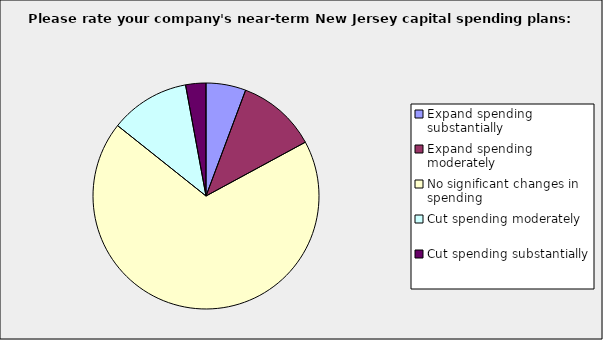
| Category | Series 0 |
|---|---|
| Expand spending substantially | 0.057 |
| Expand spending moderately | 0.114 |
| No significant changes in spending | 0.686 |
| Cut spending moderately | 0.114 |
| Cut spending substantially | 0.029 |